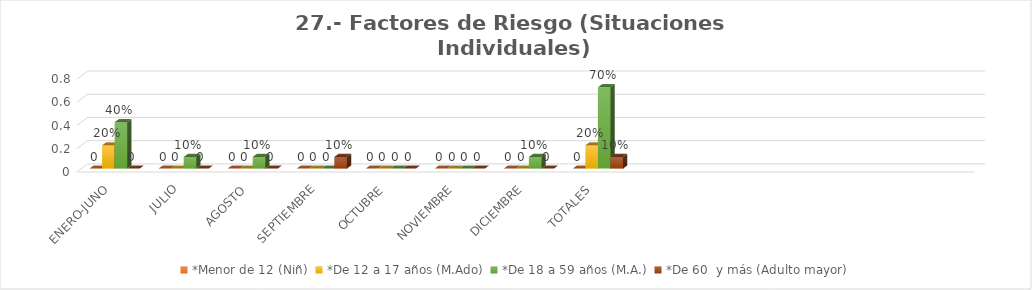
| Category | *Menor de 12 (Niñ) | *De 12 a 17 años (M.Ado) | *De 18 a 59 años (M.A.) | *De 60  y más (Adulto mayor) |
|---|---|---|---|---|
| ENERO-JUNO | 0 | 0.2 | 0.4 | 0 |
| JULIO | 0 | 0 | 0.1 | 0 |
| AGOSTO | 0 | 0 | 0.1 | 0 |
| SEPTIEMBRE | 0 | 0 | 0 | 0.1 |
| OCTUBRE | 0 | 0 | 0 | 0 |
| NOVIEMBRE | 0 | 0 | 0 | 0 |
| DICIEMBRE | 0 | 0 | 0.1 | 0 |
| TOTALES | 0 | 0.2 | 0.7 | 0.1 |